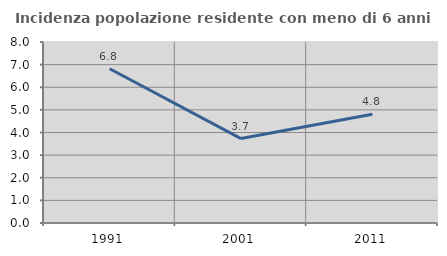
| Category | Incidenza popolazione residente con meno di 6 anni |
|---|---|
| 1991.0 | 6.82 |
| 2001.0 | 3.733 |
| 2011.0 | 4.806 |